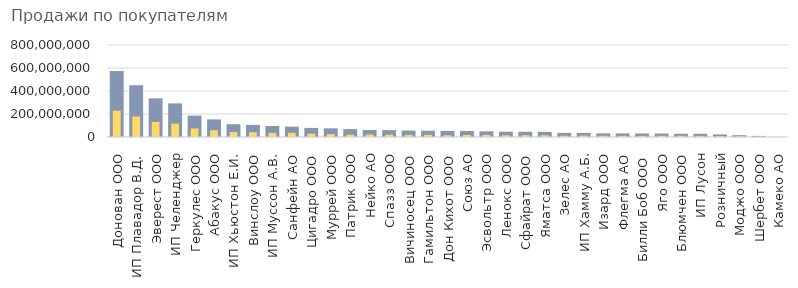
| Category | Сумма по полю Продажи без НДС |
|---|---|
| Донован ООО | 574838205.169 |
| ИП Плавадор В.Д. | 449938443.051 |
| Эверест ООО | 336016467.881 |
| ИП Челенджер | 292459338.898 |
| Геркулес ООО | 185788918.008 |
| Абакус ООО | 152999292.881 |
| ИП Хьюстон Е.И. | 111327958.941 |
| Винслоу ООО | 105123324.915 |
| ИП Муссон А.В. | 96124867.373 |
| Санфейн АО | 90088964.703 |
| Цигадро ООО | 78778616.525 |
| Муррей ООО | 75473984.958 |
| Патрик ООО | 68914767.5 |
| Нейко АО | 61324704.873 |
| Спазз ООО | 59989454.237 |
| Вичиносец ООО | 56018792.373 |
| Гамильтон ООО | 54699959.958 |
| Дон Кихот ООО | 52907346.992 |
| Союз АО | 52387151.695 |
| Эсвольтр ООО | 49583791.186 |
| Ленокс ООО | 45944033.475 |
| Сфайрат ООО | 45515921.186 |
| Яматса ООО | 44984735.593 |
| Зелес АО | 35678657.627 |
| ИП Хамму А.Б. | 35377663.008 |
| Изард ООО | 31372993.22 |
| Флегма АО | 31060954.619 |
| Билли Боб ООО | 30561791.695 |
| Яго ООО | 30291238.559 |
| Блюмчен ООО | 28360538.983 |
| ИП Лусон | 28056186.864 |
| Розничный | 22642150.424 |
| Моджо ООО | 15710552.881 |
| Шербет ООО | 9296806.017 |
| Камеко АО | 247784.873 |